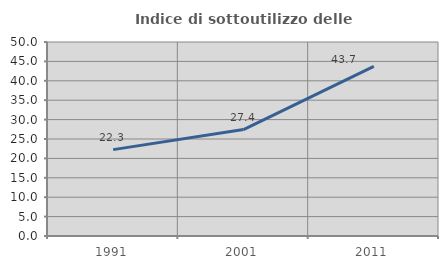
| Category | Indice di sottoutilizzo delle abitazioni  |
|---|---|
| 1991.0 | 22.259 |
| 2001.0 | 27.434 |
| 2011.0 | 43.704 |